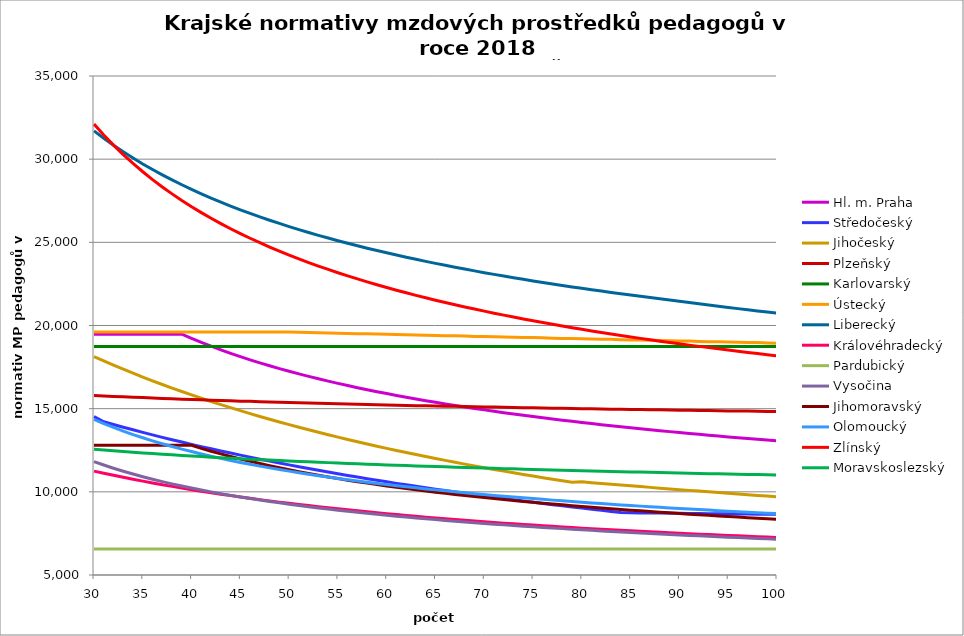
| Category | Hl. m. Praha | Středočeský | Jihočeský | Plzeňský | Karlovarský  | Ústecký   | Liberecký | Královéhradecký | Pardubický | Vysočina | Jihomoravský | Olomoucký | Zlínský | Moravskoslezský |
|---|---|---|---|---|---|---|---|---|---|---|---|---|---|---|
| 30.0 | 19479.538 | 14525.257 | 18134.436 | 15793.163 | 18733.333 | 19607.702 | 31702.323 | 11244.415 | 6567.12 | 11819.185 | 12794.049 | 14355.61 | 32111.627 | 12564.304 |
| 31.0 | 19479.538 | 14211.256 | 17873.695 | 15765.875 | 18733.333 | 19607.702 | 31257.349 | 11117.339 | 6567.12 | 11613.117 | 12794.049 | 14106.3 | 31455.25 | 12515.259 |
| 32.0 | 19479.538 | 14048.931 | 17620.345 | 15738.68 | 18733.333 | 19607.702 | 30838.246 | 10993.103 | 6567.12 | 11419.942 | 12794.049 | 13871.009 | 30844.786 | 12466.596 |
| 33.0 | 19479.538 | 13885.215 | 17374.077 | 15711.58 | 18733.333 | 19607.702 | 30442.629 | 10871.614 | 6567.12 | 11239.089 | 12794.049 | 13648.769 | 30275.304 | 12422.684 |
| 34.0 | 19479.538 | 13730.212 | 17134.598 | 15684.572 | 18733.333 | 19607.702 | 30068.405 | 10756.139 | 6567.12 | 11068.668 | 12794.049 | 13443.88 | 29742.567 | 12379.08 |
| 35.0 | 19479.538 | 13573.799 | 16901.631 | 15664.378 | 18733.333 | 19607.702 | 29713.729 | 10643.091 | 6567.12 | 10908.326 | 12794.049 | 13250.076 | 29242.913 | 12340.098 |
| 36.0 | 19479.538 | 13425.634 | 16674.914 | 15637.532 | 18733.333 | 19607.702 | 29376.972 | 10532.395 | 6567.12 | 10756.767 | 12794.049 | 13066.667 | 28773.162 | 12301.36 |
| 37.0 | 19479.538 | 13276.045 | 16454.199 | 15617.458 | 18733.333 | 19607.702 | 29056.684 | 10427.135 | 6567.12 | 10613.454 | 12794.049 | 12888.266 | 28330.537 | 12262.865 |
| 38.0 | 19479.538 | 13134.275 | 16239.251 | 15590.773 | 18733.333 | 19607.702 | 28751.575 | 10327.055 | 6567.12 | 10477.591 | 12794.049 | 12723.934 | 27912.603 | 12224.61 |
| 39.0 | 19479.538 | 12991.073 | 16029.846 | 15570.819 | 18733.333 | 19607.702 | 28460.49 | 10225.839 | 6567.12 | 10348.455 | 12794.049 | 12568.262 | 27517.211 | 12186.593 |
| 40.0 | 19227.026 | 12855.293 | 15825.772 | 15550.916 | 18733.333 | 19607.702 | 28182.392 | 10129.568 | 6567.12 | 10225.678 | 12794.049 | 12420.768 | 27142.464 | 12152.998 |
| 41.0 | 18985.707 | 12718.079 | 15626.83 | 15531.064 | 18733.333 | 19607.702 | 27916.346 | 10038.017 | 6567.12 | 10108.637 | 12615.299 | 12276.696 | 26786.673 | 12119.588 |
| 42.0 | 18755.974 | 12587.917 | 15432.827 | 15511.262 | 18733.333 | 19607.702 | 27661.511 | 9945.234 | 6567.12 | 9997.037 | 12441.474 | 12140.146 | 26448.337 | 12086.361 |
| 43.0 | 18536.949 | 12456.321 | 15243.582 | 15491.511 | 18733.333 | 19607.702 | 27417.122 | 9859.794 | 6567.12 | 9890.336 | 12280.721 | 12010.729 | 26126.109 | 12053.315 |
| 44.0 | 18327.844 | 12331.436 | 15058.922 | 15471.81 | 18733.333 | 19607.702 | 27182.486 | 9773.034 | 6567.12 | 9788.298 | 12124.068 | 11888.087 | 25818.783 | 12024.548 |
| 45.0 | 18127.948 | 12205.122 | 14878.683 | 15452.159 | 18733.333 | 19607.702 | 26956.974 | 9690.515 | 6567.12 | 9690.707 | 11975.332 | 11767.925 | 25525.273 | 11991.84 |
| 46.0 | 17936.62 | 12085.198 | 14702.707 | 15439.086 | 18733.333 | 19607.702 | 26740.008 | 9609.378 | 6567.12 | 9596.845 | 11834.076 | 11654.054 | 25244.598 | 11963.365 |
| 47.0 | 17753.275 | 11963.853 | 14530.845 | 15419.518 | 18733.333 | 19607.702 | 26531.063 | 9532.226 | 6567.12 | 9507.057 | 11699.903 | 11546.182 | 24975.87 | 11935.025 |
| 48.0 | 17577.386 | 11848.602 | 14362.954 | 15400 | 18733.333 | 19607.702 | 26329.656 | 9456.303 | 6567.12 | 9420.67 | 11568.738 | 11440.288 | 24718.286 | 11906.82 |
| 49.0 | 17408.469 | 11731.938 | 14198.899 | 15387.015 | 18733.333 | 19607.702 | 26135.344 | 9381.58 | 6567.12 | 9337.545 | 11444.106 | 11340 | 24471.111 | 11882.749 |
| 50.0 | 17246.084 | 11621.091 | 14038.549 | 15367.579 | 18733.333 | 19607.702 | 25947.719 | 9310.546 | 6567.12 | 9257.311 | 11325.682 | 11245.074 | 24233.677 | 11854.79 |
| 51.0 | 17089.828 | 11508.844 | 13881.78 | 15354.649 | 18733.333 | 19595.531 | 25766.406 | 9240.58 | 6567.12 | 9180.33 | 11213.164 | 11148.165 | 24005.375 | 11826.962 |
| 52.0 | 16939.332 | 11402.153 | 13728.474 | 15335.294 | 18733.333 | 19583.375 | 25591.058 | 9171.657 | 6567.12 | 9105.776 | 11102.859 | 11059.911 | 23785.646 | 11803.213 |
| 53.0 | 16794.256 | 11294.076 | 13578.518 | 15322.418 | 18733.333 | 19571.234 | 25421.354 | 9106.162 | 6567.12 | 9034.021 | 10998.051 | 10973.044 | 23573.975 | 11779.559 |
| 54.0 | 16654.287 | 11191.312 | 13431.801 | 15309.564 | 18733.333 | 19546.997 | 25256.996 | 9041.597 | 6567.12 | 8964.736 | 10895.204 | 10887.531 | 23369.892 | 11756 |
| 55.0 | 16519.138 | 11087.177 | 13288.222 | 15290.323 | 18733.333 | 19534.901 | 25097.707 | 8977.94 | 6567.12 | 8897.612 | 10797.489 | 10806.683 | 23172.962 | 11732.535 |
| 56.0 | 16388.542 | 10988.127 | 13147.679 | 15277.522 | 18733.333 | 19522.82 | 24943.232 | 8917.483 | 6567.12 | 8832.576 | 10701.511 | 10727.027 | 22982.783 | 11709.163 |
| 57.0 | 16262.252 | 10887.721 | 13010.078 | 15264.743 | 18733.333 | 19510.754 | 24793.332 | 8857.834 | 6567.12 | 8769.774 | 10610.341 | 10651.784 | 22798.985 | 11685.885 |
| 58.0 | 16140.04 | 10792.188 | 12875.328 | 15251.985 | 18733.333 | 19498.703 | 24647.783 | 8798.978 | 6567.12 | 8708.919 | 10523.776 | 10577.589 | 22621.225 | 11662.698 |
| 59.0 | 16021.694 | 10695.316 | 12743.34 | 15239.248 | 18733.333 | 19486.667 | 24506.378 | 8743.118 | 6567.12 | 8649.948 | 10438.613 | 10504.421 | 22449.185 | 11643.447 |
| 60.0 | 15907.017 | 10603.115 | 12614.031 | 15220.183 | 18733.333 | 19474.645 | 24368.923 | 8687.964 | 6567.12 | 8592.596 | 10354.817 | 10435.375 | 22282.569 | 11620.428 |
| 61.0 | 15795.826 | 10509.592 | 12487.32 | 15207.5 | 18733.333 | 19462.639 | 24235.236 | 8633.501 | 6567.12 | 8537.018 | 10275.277 | 10367.231 | 22121.101 | 11601.316 |
| 62.0 | 15687.949 | 10420.552 | 12363.129 | 15194.838 | 18733.333 | 19438.67 | 24105.146 | 8579.716 | 6567.12 | 8483.161 | 10199.831 | 10303.009 | 21964.526 | 11578.464 |
| 63.0 | 15583.228 | 10330.209 | 12241.384 | 15182.196 | 18733.333 | 19426.708 | 23978.493 | 8528.709 | 6567.12 | 8430.575 | 10122.646 | 10239.578 | 21812.605 | 11559.489 |
| 64.0 | 15481.511 | 10244.17 | 12122.014 | 15169.576 | 18733.333 | 19414.76 | 23855.128 | 8478.306 | 6567.12 | 8379.618 | 10052.213 | 10176.923 | 21665.115 | 11540.576 |
| 65.0 | 15382.661 | 10156.846 | 12004.949 | 15163.274 | 18733.333 | 19402.827 | 23734.91 | 8430.558 | 6567.12 | 8330.05 | 9979.994 | 10117.961 | 21521.847 | 11521.725 |
| 66.0 | 15286.545 | 10073.659 | 11890.124 | 15150.685 | 18733.333 | 19390.909 | 23617.705 | 8383.346 | 6567.12 | 8281.831 | 9911.526 | 10059.677 | 21382.607 | 11502.935 |
| 67.0 | 15193.042 | 9989.206 | 11777.474 | 15138.117 | 18733.333 | 19379.006 | 23503.389 | 8336.659 | 6567.12 | 8234.736 | 9843.99 | 10002.062 | 21247.21 | 11484.207 |
| 68.0 | 15102.037 | 9908.732 | 11666.939 | 15125.57 | 18733.333 | 19367.117 | 23391.844 | 8290.489 | 6567.12 | 8188.924 | 9780.016 | 9945.103 | 21115.486 | 11465.54 |
| 69.0 | 15013.42 | 9827.01 | 11558.459 | 15113.043 | 18733.333 | 19343.382 | 23282.958 | 8246.802 | 6567.12 | 8144.36 | 9716.868 | 9891.589 | 20987.272 | 11446.933 |
| 70.0 | 14927.089 | 9749.118 | 11451.978 | 15100.538 | 18733.333 | 19331.537 | 23176.626 | 8201.62 | 6567.12 | 8100.829 | 9657.112 | 9838.648 | 20862.418 | 11428.386 |
| 71.0 | 14842.95 | 9669.997 | 11347.441 | 15094.293 | 18733.333 | 19319.706 | 23072.749 | 8160.796 | 6567.12 | 8058.305 | 9595.537 | 9786.271 | 20740.781 | 11413.592 |
| 72.0 | 14760.911 | 9594.565 | 11244.795 | 15081.818 | 18733.333 | 19307.89 | 22971.232 | 8118.463 | 6567.12 | 8016.945 | 9537.259 | 9737.162 | 20622.226 | 11395.153 |
| 73.0 | 14680.888 | 9517.923 | 11143.99 | 15069.364 | 18733.333 | 19296.088 | 22871.987 | 8078.461 | 6567.12 | 7976.54 | 9482.174 | 9688.544 | 20506.626 | 11380.445 |
| 74.0 | 14602.798 | 9444.835 | 11044.975 | 15056.931 | 18733.333 | 19284.301 | 22774.929 | 8038.851 | 6567.12 | 7937.069 | 9425.261 | 9640.409 | 20393.862 | 11362.113 |
| 75.0 | 14526.567 | 9370.558 | 10947.705 | 15050.722 | 18733.333 | 19272.527 | 22679.977 | 7999.628 | 6567.12 | 7898.509 | 9371.458 | 9592.749 | 20283.82 | 11347.49 |
| 76.0 | 14452.121 | 9299.707 | 10852.133 | 15038.319 | 18733.333 | 19260.769 | 22587.056 | 7962.627 | 6567.12 | 7860.841 | 9320.671 | 9548.168 | 20176.393 | 11329.264 |
| 77.0 | 14379.393 | 9227.686 | 10758.216 | 15025.937 | 18733.333 | 19237.294 | 22496.093 | 7924.143 | 6567.12 | 7823.873 | 9268.052 | 9501.415 | 20071.481 | 11314.726 |
| 78.0 | 14308.318 | 9158.972 | 10665.91 | 15019.753 | 18733.333 | 19225.579 | 22407.02 | 7889.643 | 6567.12 | 7787.929 | 9218.377 | 9457.677 | 19968.987 | 11300.224 |
| 79.0 | 14238.834 | 9089.106 | 10575.174 | 15007.401 | 18733.333 | 19213.877 | 22319.77 | 7853.65 | 6567.12 | 7752.65 | 9169.231 | 9416.878 | 19868.82 | 11285.76 |
| 80.0 | 14170.883 | 9022.433 | 10600.315 | 15001.233 | 18733.333 | 19202.19 | 22234.283 | 7817.984 | 6567.12 | 7718.188 | 9122.91 | 9373.913 | 19770.895 | 11271.333 |
| 81.0 | 14104.41 | 8954.627 | 10551.577 | 14988.912 | 18733.333 | 19190.517 | 22150.497 | 7784.4 | 6567.12 | 7684.362 | 9074.774 | 9333.832 | 19675.128 | 11256.942 |
| 82.0 | 14039.362 | 8889.904 | 10503.285 | 14982.759 | 18733.333 | 19178.858 | 22068.357 | 7751.103 | 6567.12 | 7651.322 | 9029.4 | 9291.62 | 19581.444 | 11242.588 |
| 83.0 | 13975.689 | 8824.069 | 10455.433 | 14970.468 | 18733.333 | 19167.213 | 21987.809 | 7719.821 | 6567.12 | 7618.889 | 8984.478 | 9252.238 | 19489.766 | 11228.271 |
| 84.0 | 13913.343 | 8761.213 | 10408.015 | 14964.33 | 18733.333 | 19143.966 | 21908.801 | 7687.073 | 6567.12 | 7587.213 | 8942.213 | 9215.62 | 19400.026 | 11213.99 |
| 85.0 | 13852.279 | 8739.124 | 10361.025 | 14952.069 | 18733.333 | 19132.364 | 21831.284 | 7656.304 | 6567.12 | 7556.119 | 8898.152 | 9176.879 | 19312.156 | 11199.746 |
| 86.0 | 13792.453 | 8733.12 | 10314.458 | 14945.946 | 18733.333 | 19120.775 | 21755.21 | 7625.781 | 6567.12 | 7525.595 | 8856.694 | 9140.853 | 19226.093 | 11185.538 |
| 87.0 | 13733.825 | 8727.123 | 10268.307 | 14933.715 | 18733.333 | 19109.201 | 21680.535 | 7595.5 | 6567.12 | 7495.631 | 8815.621 | 9102.737 | 19141.775 | 11171.365 |
| 88.0 | 13676.355 | 8721.134 | 10222.567 | 14927.607 | 18733.333 | 19097.641 | 21607.216 | 7567.121 | 6567.12 | 7466.372 | 8774.927 | 9067.29 | 19059.144 | 11157.229 |
| 89.0 | 13620.005 | 8715.154 | 10177.233 | 14915.407 | 18733.333 | 19086.094 | 21535.211 | 7538.953 | 6567.12 | 7437.649 | 8736.72 | 9032.118 | 18978.145 | 11146.65 |
| 90.0 | 13564.739 | 8707.193 | 10132.3 | 14909.314 | 18733.333 | 19074.562 | 21464.481 | 7510.995 | 6567.12 | 7409.454 | 8698.844 | 8999.536 | 18898.726 | 11132.576 |
| 91.0 | 13510.523 | 8701.232 | 10087.761 | 14903.226 | 18733.333 | 19063.043 | 21385.963 | 7483.243 | 6567.12 | 7381.625 | 8659.218 | 8964.887 | 18820.835 | 11118.537 |
| 92.0 | 13457.325 | 8695.279 | 10043.612 | 14891.065 | 18733.333 | 19040.048 | 21308.867 | 7455.695 | 6567.12 | 7354.457 | 8624.069 | 8932.788 | 18744.425 | 11108.031 |
| 93.0 | 13405.112 | 8689.335 | 9999.848 | 14884.992 | 18733.333 | 19028.571 | 21233.149 | 7429.953 | 6567.12 | 7327.788 | 8587.161 | 8900.917 | 18669.448 | 11094.055 |
| 94.0 | 13353.855 | 8683.398 | 9956.464 | 14878.924 | 18733.333 | 19017.108 | 21158.768 | 7404.387 | 6567.12 | 7301.611 | 8550.568 | 8867.022 | 18595.861 | 11083.595 |
| 95.0 | 13303.525 | 8677.469 | 9913.455 | 14866.802 | 18733.333 | 19005.659 | 21085.685 | 7378.997 | 6567.12 | 7275.767 | 8516.293 | 8835.619 | 18523.622 | 11069.68 |
| 96.0 | 13254.093 | 8671.549 | 9870.815 | 14860.749 | 18733.333 | 18994.224 | 21013.864 | 7353.78 | 6567.12 | 7250.547 | 8482.292 | 8806.657 | 18452.69 | 11059.266 |
| 97.0 | 13205.535 | 8663.667 | 9828.541 | 14854.701 | 18733.333 | 18982.802 | 20943.266 | 7330.296 | 6567.12 | 7225.647 | 8448.561 | 8775.678 | 18383.025 | 11045.412 |
| 98.0 | 13157.823 | 8657.766 | 9786.627 | 14842.619 | 18733.333 | 18971.394 | 20873.858 | 7305.411 | 6567.12 | 7201.063 | 8415.098 | 8744.917 | 18314.591 | 11035.044 |
| 99.0 | 13110.934 | 8651.872 | 9745.07 | 14836.585 | 18733.333 | 18948.619 | 20805.606 | 7282.234 | 6567.12 | 7177.077 | 8381.898 | 8716.546 | 18247.352 | 11024.695 |
| 100.0 | 13064.844 | 8645.986 | 9703.864 | 14830.557 | 18733.333 | 18937.253 | 20738.479 | 7259.203 | 6567.12 | 7153.394 | 8350.89 | 8688.358 | 18181.273 | 11010.927 |